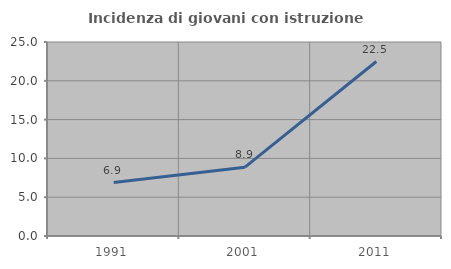
| Category | Incidenza di giovani con istruzione universitaria |
|---|---|
| 1991.0 | 6.88 |
| 2001.0 | 8.87 |
| 2011.0 | 22.484 |